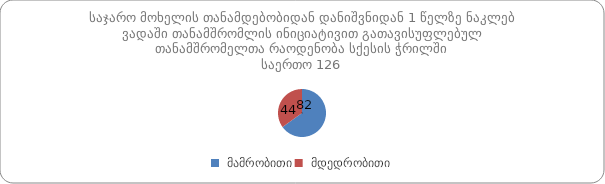
| Category | Series 0 |
|---|---|
|  მამრობითი | 82 |
|  მდედრობითი | 44 |